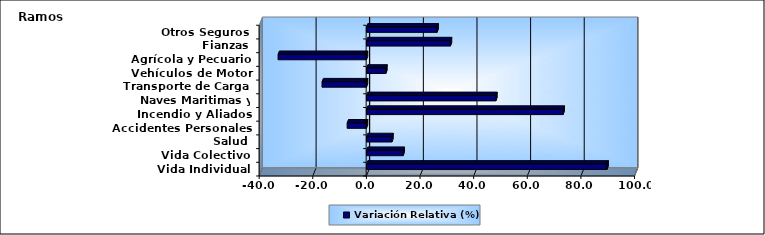
| Category | Variación Relativa (%) |
|---|---|
| Vida Individual | 89.733 |
| Vida Colectivo | 13.673 |
| Salud | 9.491 |
| Accidentes Personales | -7.214 |
| Incendio y Aliados | 73.346 |
| Naves Maritimas y Aéreas | 48.265 |
| Transporte de Carga | -16.584 |
| Vehículos de Motor | 7.227 |
| Agrícola y Pecuario | -32.972 |
| Fianzas | 31.319 |
| Otros Seguros | 26.326 |